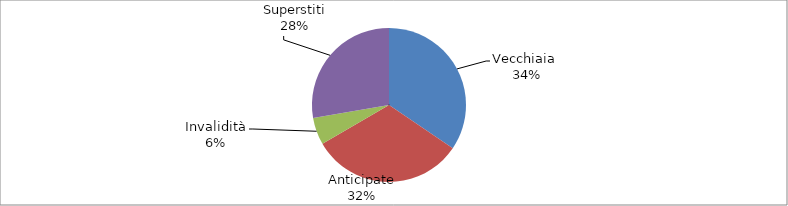
| Category | Series 0 |
|---|---|
| Vecchiaia  | 26652 |
| Anticipate | 24844 |
| Invalidità | 4402 |
| Superstiti | 21405 |